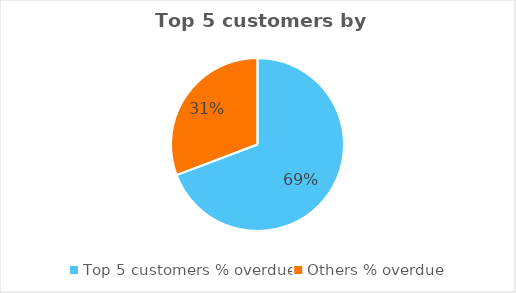
| Category | Series 0 |
|---|---|
| Top 5 customers % overdue | 0.693 |
| Others % overdue | 0.307 |